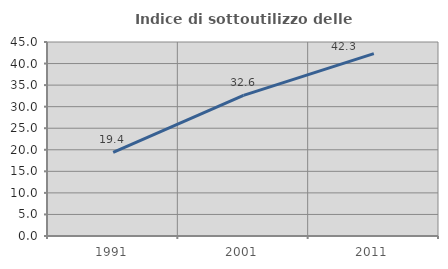
| Category | Indice di sottoutilizzo delle abitazioni  |
|---|---|
| 1991.0 | 19.376 |
| 2001.0 | 32.62 |
| 2011.0 | 42.317 |